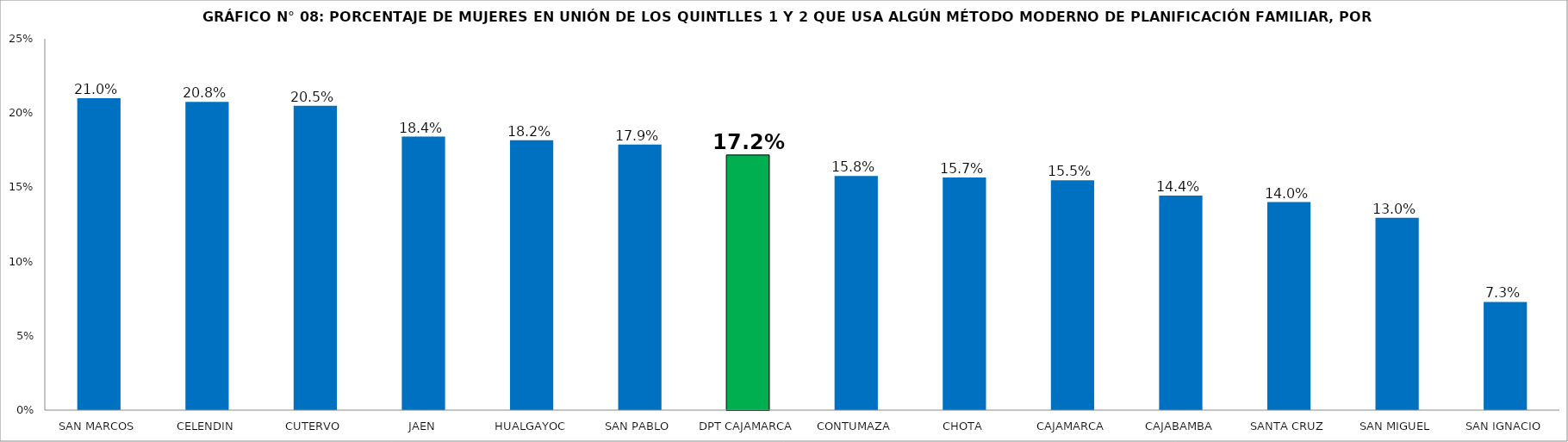
| Category | Series 0 |
|---|---|
| SAN MARCOS | 0.21 |
| CELENDIN | 0.208 |
| CUTERVO | 0.205 |
| JAEN | 0.184 |
| HUALGAYOC | 0.182 |
| SAN PABLO | 0.179 |
| DPT CAJAMARCA | 0.172 |
| CONTUMAZA | 0.158 |
| CHOTA | 0.157 |
| CAJAMARCA | 0.155 |
| CAJABAMBA | 0.144 |
| SANTA CRUZ | 0.14 |
| SAN MIGUEL | 0.13 |
| SAN IGNACIO | 0.073 |